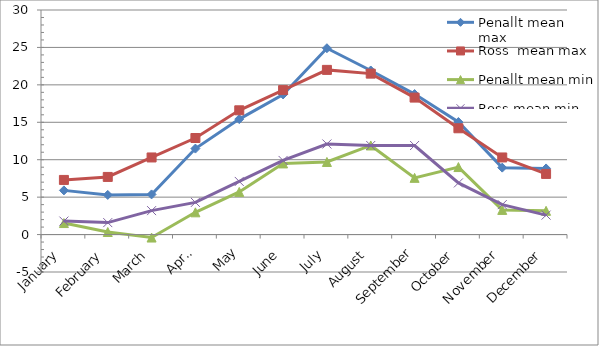
| Category | Penallt mean max | Ross  mean max | Penallt mean min | Ross mean min |
|---|---|---|---|---|
| January | 5.903 | 7.3 | 1.539 | 1.8 |
| February | 5.296 | 7.7 | 0.343 | 1.6 |
| March | 5.365 | 10.3 | -0.397 | 3.2 |
| April | 11.487 | 12.9 | 2.973 | 4.3 |
| May | 15.426 | 16.6 | 5.697 | 7.1 |
| June | 18.72 | 19.3 | 9.503 | 9.9 |
| July | 24.894 | 22 | 9.7 | 12.1 |
| August | 21.919 | 21.5 | 11.903 | 11.9 |
| September | 18.77 | 18.3 | 7.576 | 11.9 |
| October | 15.035 | 14.2 | 9.019 | 6.9 |
| November | 8.941 | 10.3 | 3.297 | 4 |
| December | 8.834 | 8.1 | 3.172 | 2.6 |